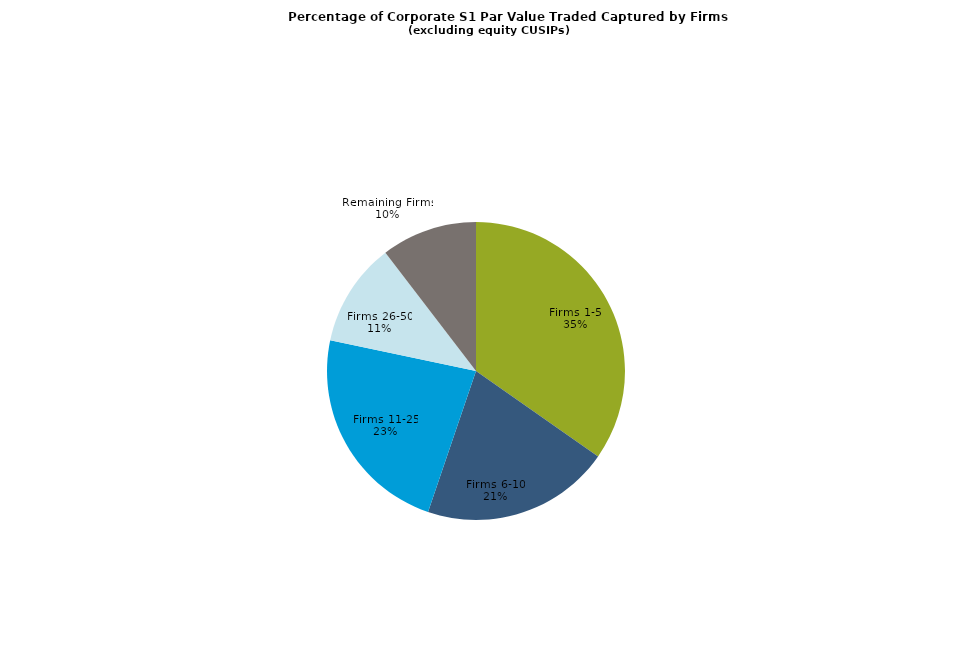
| Category | Series 0 |
|---|---|
| Firms 1-5 | 0.347 |
| Firms 6-10 | 0.205 |
| Firms 11-25 | 0.231 |
| Firms 26-50 | 0.113 |
| Remaining Firms | 0.104 |